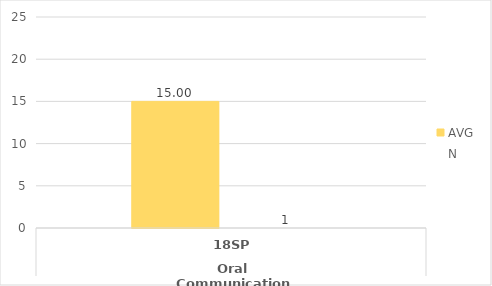
| Category | ENGL.AA - AVG | ENGL.AA - N |
|---|---|---|
| 0 | 15 | 1 |